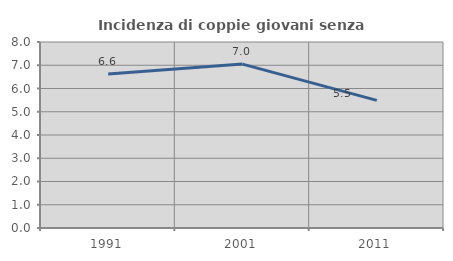
| Category | Incidenza di coppie giovani senza figli |
|---|---|
| 1991.0 | 6.624 |
| 2001.0 | 7.049 |
| 2011.0 | 5.488 |